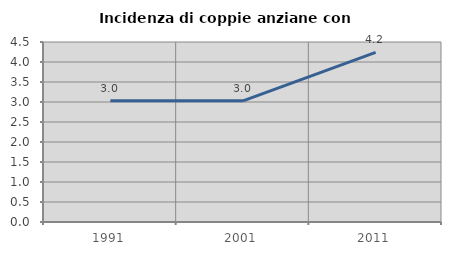
| Category | Incidenza di coppie anziane con figli |
|---|---|
| 1991.0 | 3.03 |
| 2001.0 | 3.03 |
| 2011.0 | 4.242 |